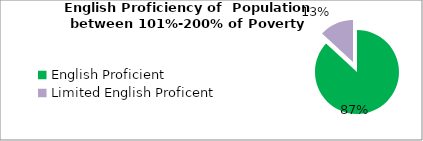
| Category | Percent |
|---|---|
| English Proficient | 0.868 |
| Limited English Proficent | 0.132 |